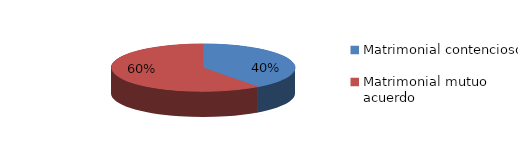
| Category | Series 0 |
|---|---|
| 0 | 422 |
| 1 | 636 |